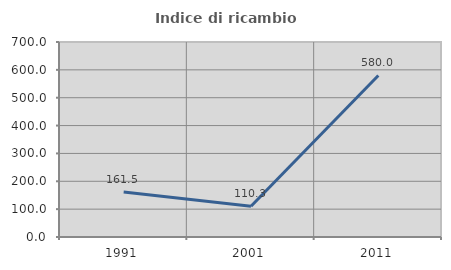
| Category | Indice di ricambio occupazionale  |
|---|---|
| 1991.0 | 161.538 |
| 2001.0 | 110.345 |
| 2011.0 | 580 |